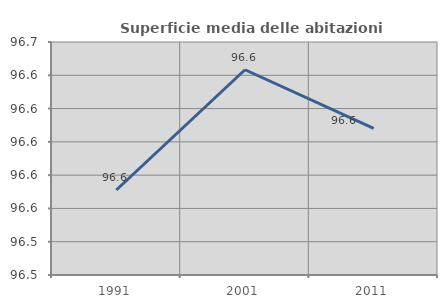
| Category | Superficie media delle abitazioni occupate |
|---|---|
| 1991.0 | 96.571 |
| 2001.0 | 96.643 |
| 2011.0 | 96.608 |